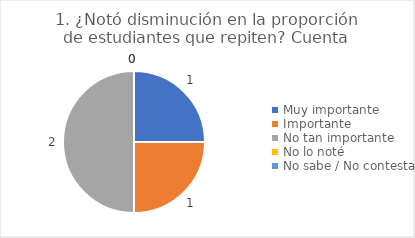
| Category | 1. ¿Notó disminución en la proporción de estudiantes que repiten? |
|---|---|
| Muy importante  | 0.25 |
| Importante  | 0.25 |
| No tan importante  | 0.5 |
| No lo noté  | 0 |
| No sabe / No contesta | 0 |